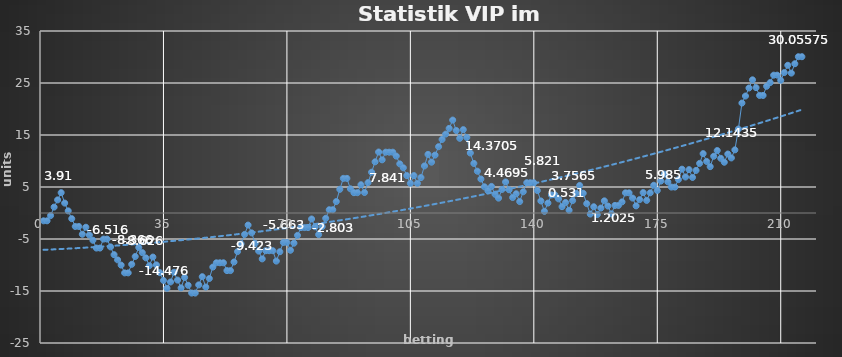
| Category | Series 0 |
|---|---|
| 0 | -1.5 |
| 1 | -1.5 |
| 2 | -0.5 |
| 3 | 1.135 |
| 4 | 2.522 |
| 5 | 3.91 |
| 6 | 1.91 |
| 7 | 0.41 |
| 8 | -1.09 |
| 9 | -2.59 |
| 10 | -2.59 |
| 11 | -4.09 |
| 12 | -2.74 |
| 13 | -4.24 |
| 14 | -5.24 |
| 15 | -6.74 |
| 16 | -6.74 |
| 17 | -5.016 |
| 18 | -5.016 |
| 19 | -6.516 |
| 20 | -8.016 |
| 21 | -9.016 |
| 22 | -10.016 |
| 23 | -11.516 |
| 24 | -11.516 |
| 25 | -9.866 |
| 26 | -8.366 |
| 27 | -6.626 |
| 28 | -7.626 |
| 29 | -8.626 |
| 30 | -10.126 |
| 31 | -8.476 |
| 32 | -9.976 |
| 33 | -11.476 |
| 34 | -12.976 |
| 35 | -14.476 |
| 36 | -13.266 |
| 37 | -11.398 |
| 38 | -12.898 |
| 39 | -14.398 |
| 40 | -12.398 |
| 41 | -13.898 |
| 42 | -15.398 |
| 43 | -15.398 |
| 44 | -13.823 |
| 45 | -12.248 |
| 46 | -14.248 |
| 47 | -12.598 |
| 48 | -10.398 |
| 49 | -9.573 |
| 50 | -9.573 |
| 51 | -9.573 |
| 52 | -11.073 |
| 53 | -11.073 |
| 54 | -9.423 |
| 55 | -7.423 |
| 56 | -5.923 |
| 57 | -4.123 |
| 58 | -2.323 |
| 59 | -3.823 |
| 60 | -5.823 |
| 61 | -7.323 |
| 62 | -8.823 |
| 63 | -7.248 |
| 64 | -7.248 |
| 65 | -7.248 |
| 66 | -9.248 |
| 67 | -7.448 |
| 68 | -5.663 |
| 69 | -5.663 |
| 70 | -7.163 |
| 71 | -5.803 |
| 72 | -4.303 |
| 73 | -2.803 |
| 74 | -2.803 |
| 75 | -2.803 |
| 76 | -1.153 |
| 77 | -2.653 |
| 78 | -4.153 |
| 79 | -2.623 |
| 80 | -1.018 |
| 81 | 0.632 |
| 82 | 0.632 |
| 83 | 2.202 |
| 84 | 4.557 |
| 85 | 6.657 |
| 86 | 6.657 |
| 87 | 4.657 |
| 88 | 3.907 |
| 89 | 3.907 |
| 90 | 5.437 |
| 91 | 3.937 |
| 92 | 5.841 |
| 93 | 7.841 |
| 94 | 9.841 |
| 95 | 11.727 |
| 96 | 10.227 |
| 97 | 11.697 |
| 98 | 11.697 |
| 99 | 11.697 |
| 100 | 10.947 |
| 101 | 9.447 |
| 102 | 8.697 |
| 103 | 7.197 |
| 104 | 5.697 |
| 105 | 7.197 |
| 106 | 5.697 |
| 107 | 6.817 |
| 108 | 9.052 |
| 109 | 11.272 |
| 110 | 9.772 |
| 111 | 11.135 |
| 112 | 12.755 |
| 113 | 14.15 |
| 114 | 15.17 |
| 115 | 16.27 |
| 116 | 17.87 |
| 117 | 15.87 |
| 118 | 14.37 |
| 119 | 16.036 |
| 120 | 14.536 |
| 121 | 11.536 |
| 122 | 9.536 |
| 123 | 8.036 |
| 124 | 6.536 |
| 125 | 5.036 |
| 126 | 4.286 |
| 127 | 5.111 |
| 128 | 3.611 |
| 129 | 2.861 |
| 130 | 4.541 |
| 131 | 5.969 |
| 132 | 4.469 |
| 133 | 2.969 |
| 134 | 3.697 |
| 135 | 2.197 |
| 136 | 4.083 |
| 137 | 5.821 |
| 138 | 5.821 |
| 139 | 5.821 |
| 140 | 4.321 |
| 141 | 2.321 |
| 142 | 0.321 |
| 143 | 1.911 |
| 144 | 3.471 |
| 145 | 3.471 |
| 146 | 2.721 |
| 147 | 1.221 |
| 148 | 2.031 |
| 149 | 0.531 |
| 150 | 2.381 |
| 151 | 3.756 |
| 152 | 5.301 |
| 153 | 3.801 |
| 154 | 1.801 |
| 155 | -0.199 |
| 156 | 1.202 |
| 157 | -0.298 |
| 158 | 0.952 |
| 159 | 2.34 |
| 160 | 1.34 |
| 161 | -0.16 |
| 162 | 1.46 |
| 163 | 1.46 |
| 164 | 2.135 |
| 165 | 3.875 |
| 166 | 3.875 |
| 167 | 2.875 |
| 168 | 1.375 |
| 169 | 2.575 |
| 170 | 3.925 |
| 171 | 2.425 |
| 172 | 3.88 |
| 173 | 5.335 |
| 174 | 4.335 |
| 175 | 6.135 |
| 176 | 7.485 |
| 177 | 5.985 |
| 178 | 4.985 |
| 179 | 4.985 |
| 180 | 6.426 |
| 181 | 8.426 |
| 182 | 6.926 |
| 183 | 8.341 |
| 184 | 6.841 |
| 185 | 8.191 |
| 186 | 9.541 |
| 187 | 11.416 |
| 188 | 9.916 |
| 189 | 8.916 |
| 190 | 10.916 |
| 191 | 12.016 |
| 192 | 10.516 |
| 193 | 9.766 |
| 194 | 11.341 |
| 195 | 10.591 |
| 196 | 12.143 |
| 197 | 16.143 |
| 198 | 21.143 |
| 199 | 22.493 |
| 200 | 24.038 |
| 201 | 25.614 |
| 202 | 24.114 |
| 203 | 22.614 |
| 204 | 22.614 |
| 205 | 24.374 |
| 206 | 25.081 |
| 207 | 26.506 |
| 208 | 26.506 |
| 209 | 25.506 |
| 210 | 27.006 |
| 211 | 28.406 |
| 212 | 26.906 |
| 213 | 28.706 |
| 214 | 30.056 |
| 215 | 30.056 |